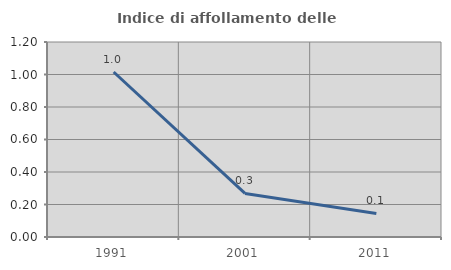
| Category | Indice di affollamento delle abitazioni  |
|---|---|
| 1991.0 | 1.015 |
| 2001.0 | 0.268 |
| 2011.0 | 0.145 |